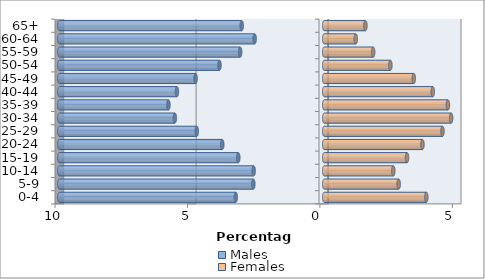
| Category | Males | Females |
|---|---|---|
| 0-4 | -3.338 | 3.855 |
| 5-9 | -2.676 | 2.811 |
| 10-14 | -2.663 | 2.608 |
| 15-19 | -3.245 | 3.126 |
| 20-24 | -3.849 | 3.709 |
| 25-29 | -4.812 | 4.464 |
| 30-34 | -5.639 | 4.793 |
| 35-39 | -5.882 | 4.671 |
| 40-44 | -5.561 | 4.098 |
| 45-49 | -4.857 | 3.381 |
| 50-54 | -3.955 | 2.498 |
| 55-59 | -3.173 | 1.847 |
| 60-64 | -2.626 | 1.193 |
| 65+ | -3.114 | 1.555 |